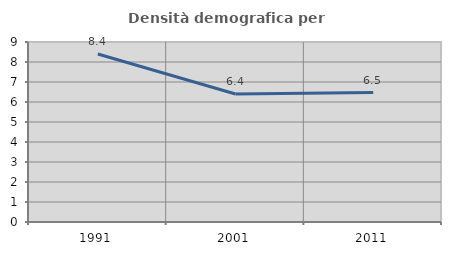
| Category | Densità demografica |
|---|---|
| 1991.0 | 8.397 |
| 2001.0 | 6.401 |
| 2011.0 | 6.47 |